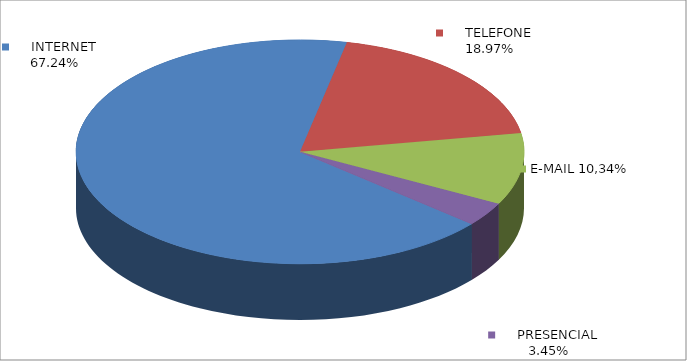
| Category | Series 0 |
|---|---|
|      INTERNET | 0.672 |
|      TELEFONE | 0.19 |
|      E-MAIL | 0.103 |
|      PRESENCIAL | 0.034 |